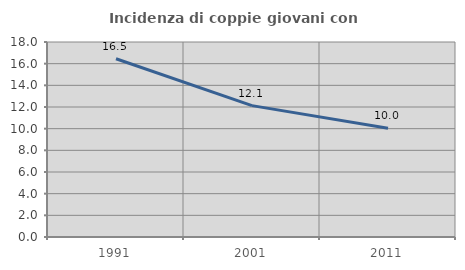
| Category | Incidenza di coppie giovani con figli |
|---|---|
| 1991.0 | 16.458 |
| 2001.0 | 12.127 |
| 2011.0 | 10.044 |